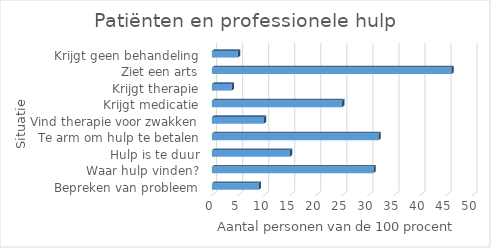
| Category | Series 0 |
|---|---|
| Bepreken van probleem | 9 |
| Waar hulp vinden? | 31 |
| Hulp is te duur | 15 |
| Te arm om hulp te betalen | 32 |
| Vind therapie voor zwakken | 10 |
| Krijgt medicatie | 25 |
| Krijgt therapie | 3.8 |
| Ziet een arts | 46 |
| Krijgt geen behandeling | 5 |